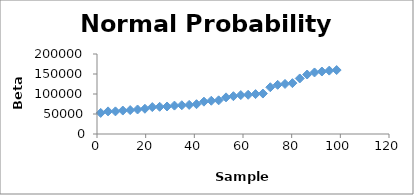
| Category | Series 0 |
|---|---|
| 1.5151515151515151 | 52678.7 |
| 4.545454545454545 | 56543.6 |
| 7.575757575757576 | 56589.8 |
| 10.606060606060606 | 58627.5 |
| 13.636363636363637 | 59809.8 |
| 16.666666666666668 | 61275 |
| 19.696969696969695 | 63147.4 |
| 22.727272727272727 | 67338.6 |
| 25.757575757575758 | 68025.9 |
| 28.78787878787879 | 68769.3 |
| 31.81818181818182 | 70999 |
| 34.84848484848485 | 71881.3 |
| 37.878787878787875 | 72702.1 |
| 40.90909090909091 | 74517.4 |
| 43.93939393939394 | 80859.3 |
| 46.96969696969697 | 83132.9 |
| 50.0 | 84175.6 |
| 53.03030303030303 | 91574.3 |
| 56.06060606060606 | 94553.2 |
| 59.09090909090909 | 97323.7 |
| 62.121212121212125 | 98067.2 |
| 65.15151515151514 | 99746.4 |
| 68.18181818181819 | 101097.6 |
| 71.21212121212122 | 116905.6 |
| 74.24242424242424 | 122921.6 |
| 77.27272727272727 | 125131.9 |
| 80.3030303030303 | 127134.9 |
| 83.33333333333333 | 138859.4 |
| 86.36363636363636 | 148723.6 |
| 89.39393939393939 | 153837.1 |
| 92.42424242424242 | 156176.2 |
| 95.45454545454545 | 158444.1 |
| 98.48484848484848 | 159879.9 |